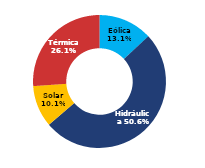
| Category | Sur |
|---|---|
| Eólica | 74.264 |
| Hidráulica | 286.413 |
| Solar | 57.34 |
| Térmica | 147.692 |